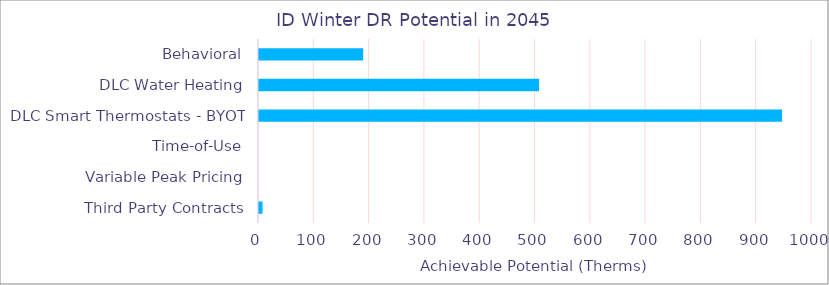
| Category | ID |
|---|---|
| Behavioral | 190.254 |
| DLC Water Heating | 508.306 |
| DLC Smart Thermostats - BYOT | 947.673 |
| Time-of-Use | 0 |
| Variable Peak Pricing | 0 |
| Third Party Contracts | 8.208 |